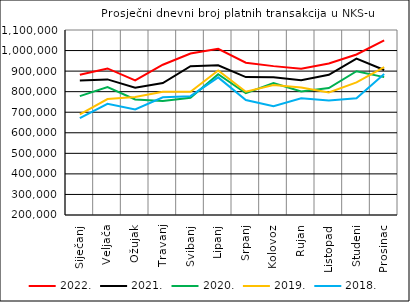
| Category | 2022. | 2021. | 2020. | 2019. | 2018. |
|---|---|---|---|---|---|
| Siječanj | 882511.45 | 853754.053 | 778386.81 | 689751.091 | 670809.409 |
| Veljača | 912942.45 | 859628.3 | 822257.2 | 763826.65 | 741137.75 |
| Ožujak | 854937 | 818802.696 | 761733.545 | 773935 | 713060.591 |
| Travanj | 930995.85 | 841884.19 | 754915.524 | 799356.238 | 772291.75 |
| Svibanj | 985566.143 | 923925.619 | 770679.5 | 799842.5 | 778037.762 |
| Lipanj | 1008762.1 | 928567.35 | 885057.1 | 902740.833 | 869634.895 |
| Srpanj | 940873.905 | 870946.727 | 792290.391 | 799875.957 | 759128.091 |
| Kolovoz | 924251.524 | 870563.381 | 841869.45 | 831878.4 | 729390.5 |
| Rujan | 911815.864 | 855873.955 | 800855.227 | 820234.619 | 767941.55 |
| Listopad | 937400.095 | 882185.333 | 817634.955 | 795833.545 | 757187.045 |
| Studeni | 980951.85 | 961075.6 | 899582.25 | 844880.2 | 768167.524 |
| Prosinac | 1050046.19 | 905247.522 | 870844.364 | 919506.8 | 886204.421 |